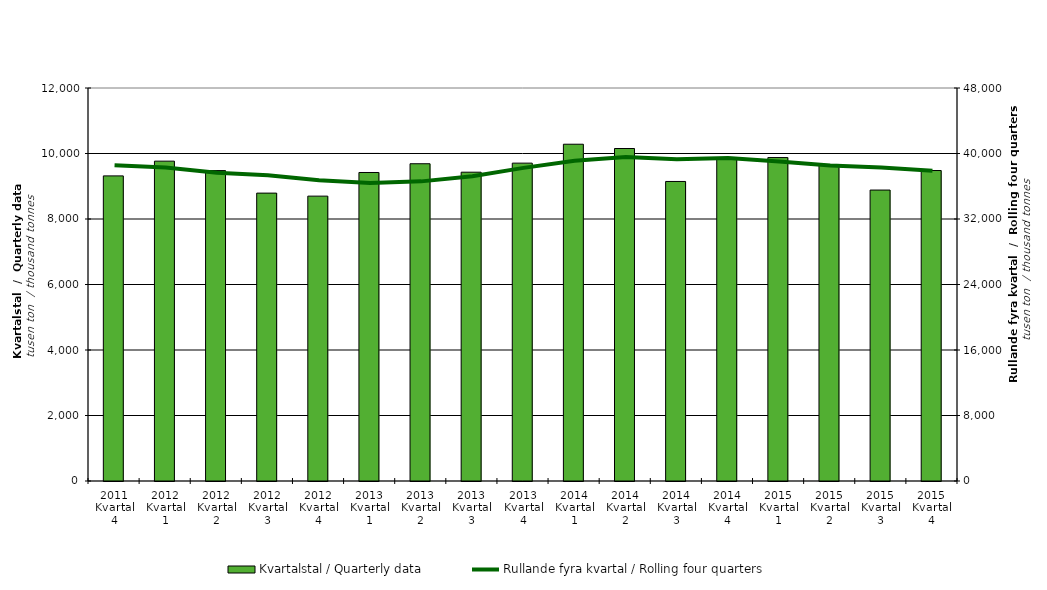
| Category | Kvartalstal / Quarterly data |
|---|---|
| 2011 Kvartal 4 | 9316.555 |
| 2012 Kvartal 1 | 9766.245 |
| 2012 Kvartal 2 | 9478.033 |
| 2012 Kvartal 3 | 8790.367 |
| 2012 Kvartal 4 | 8698.29 |
| 2013 Kvartal 1 | 9419.913 |
| 2013 Kvartal 2 | 9687.037 |
| 2013 Kvartal 3 | 9429.357 |
| 2013 Kvartal 4 | 9705.756 |
| 2014 Kvartal 1 | 10283.241 |
| 2014 Kvartal 2 | 10152.427 |
| 2014 Kvartal 3 | 9146.144 |
| 2014 Kvartal 4 | 9854.974 |
| 2015 Kvartal 1 | 9875.703 |
| 2015 Kvartal 2 | 9664.823 |
| 2015 Kvartal 3 | 8883.826 |
| 2015 Kvartal 4 | 9480.075 |